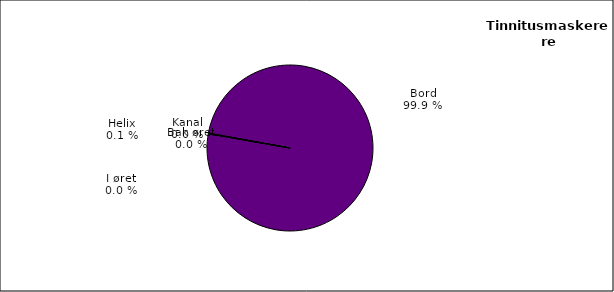
| Category | Series 0 |
|---|---|
| Bak øret | 0 |
| I øret | 0 |
| Kanal | 0 |
| Helix | 1 |
| Bord | 1023 |